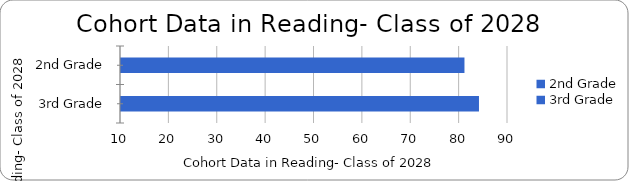
| Category | Cohort Data in Reading- Class of 2028 |
|---|---|
| 2nd Grade | 81 |
| 3rd Grade | 84 |